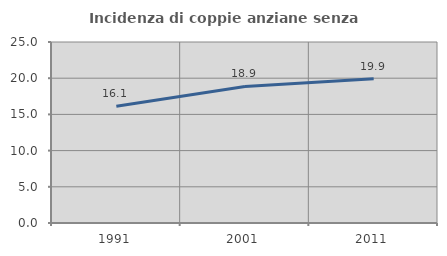
| Category | Incidenza di coppie anziane senza figli  |
|---|---|
| 1991.0 | 16.134 |
| 2001.0 | 18.855 |
| 2011.0 | 19.917 |